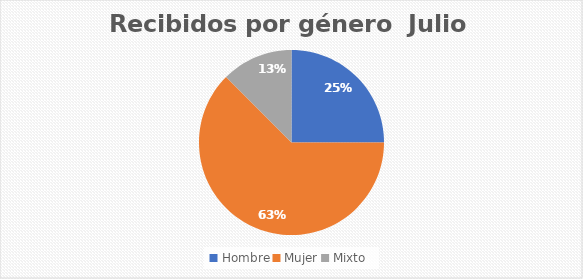
| Category | Recibidos por género  Julio |
|---|---|
| Hombre | 2 |
| Mujer | 5 |
| Mixto | 1 |